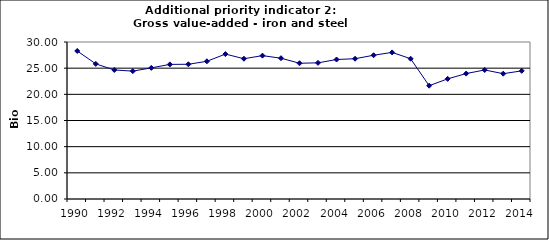
| Category | Gross value-added - iron and steel industry, Bio Euro (EC95) |
|---|---|
| 1990 | 28.283 |
| 1991 | 25.817 |
| 1992 | 24.658 |
| 1993 | 24.436 |
| 1994 | 25.053 |
| 1995 | 25.719 |
| 1996 | 25.743 |
| 1997 | 26.311 |
| 1998 | 27.691 |
| 1999 | 26.804 |
| 2000 | 27.395 |
| 2001 | 26.902 |
| 2002 | 25.941 |
| 2003 | 26.015 |
| 2004 | 26.656 |
| 2005 | 26.804 |
| 2006 | 27.469 |
| 2007 | 28.012 |
| 2008 | 26.804 |
| 2009 | 21.65 |
| 2010 | 22.957 |
| 2011 | 23.968 |
| 2012 | 24.658 |
| 2013 | 23.943 |
| 2014 | 24.486 |